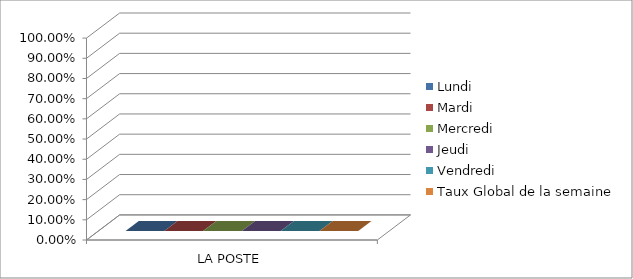
| Category | Lundi | Mardi | Mercredi | Jeudi | Vendredi | Taux Global de la semaine |
|---|---|---|---|---|---|---|
| 0 | 0 | 0 | 0 | 0 | 0 | 0 |